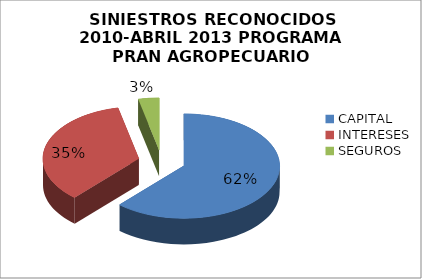
| Category | PRAN AGROPECUARIO |
|---|---|
| CAPITAL | 0.617 |
| INTERESES | 0.348 |
| SEGUROS  | 0.035 |